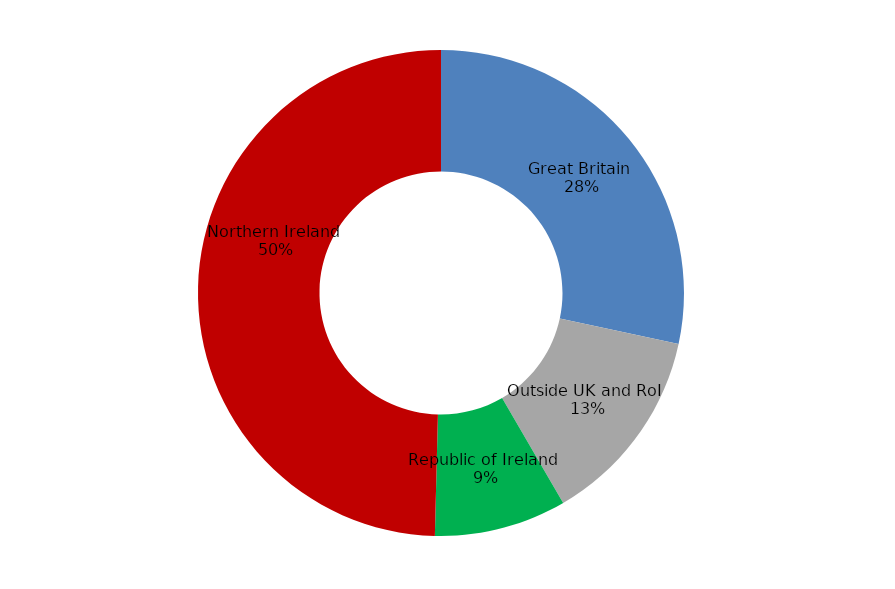
| Category | Overnight Trips  |
|---|---|
| Great Britain  | 1182594 |
| Outside UK and RoI  | 552275 |
| Republic of Ireland  | 366260 |
| Northern Ireland  | 2067654 |